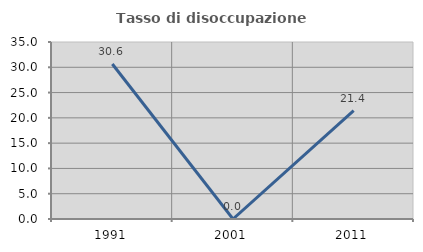
| Category | Tasso di disoccupazione giovanile  |
|---|---|
| 1991.0 | 30.645 |
| 2001.0 | 0 |
| 2011.0 | 21.429 |